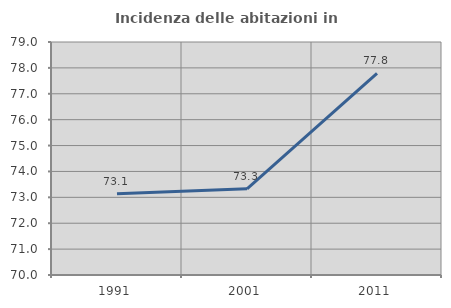
| Category | Incidenza delle abitazioni in proprietà  |
|---|---|
| 1991.0 | 73.142 |
| 2001.0 | 73.329 |
| 2011.0 | 77.785 |